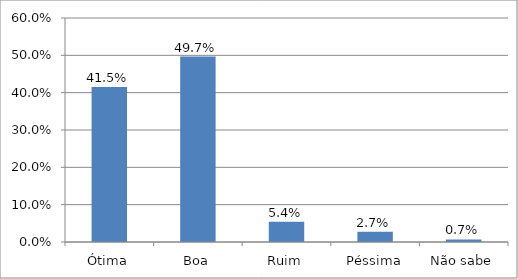
| Category | Series 0 |
|---|---|
| Ótima | 0.415 |
| Boa | 0.497 |
| Ruim | 0.054 |
| Péssima | 0.027 |
| Não sabe | 0.007 |